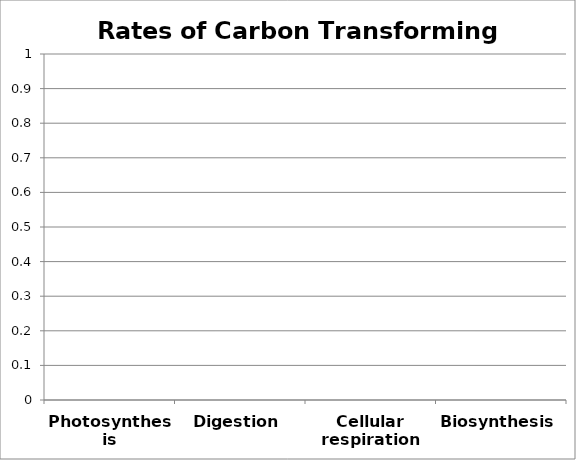
| Category | Series 0 |
|---|---|
| Photosynthesis | 0 |
| Digestion | 0 |
| Cellular respiration | 0 |
| Biosynthesis | 0 |